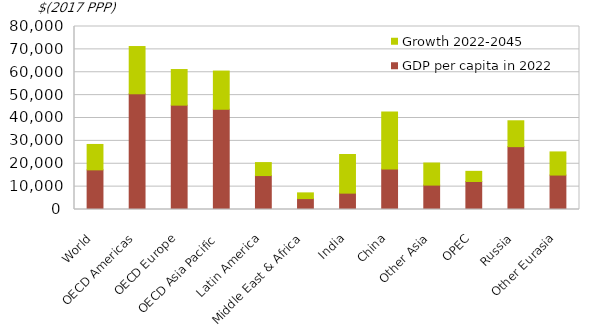
| Category | GDP per capita in 2022 | Growth 2022-2045 |
|---|---|---|
| World | 17334.878 | 11100.825 |
| OECD Americas | 50587.053 | 20655.991 |
| OECD Europe | 45615.347 | 15572.382 |
| OECD Asia Pacific | 43823.361 | 16696.459 |
| Latin America | 14838.158 | 5671.045 |
| Middle East & Africa | 4775.333 | 2492.529 |
| India | 7149.418 | 16907.184 |
| China | 17661.337 | 24982.706 |
| Other Asia | 10668.851 | 9654.126 |
| OPEC | 12249.789 | 4427.419 |
| Russia | 27474.968 | 11307.464 |
| Other Eurasia | 15056.038 | 10118.212 |